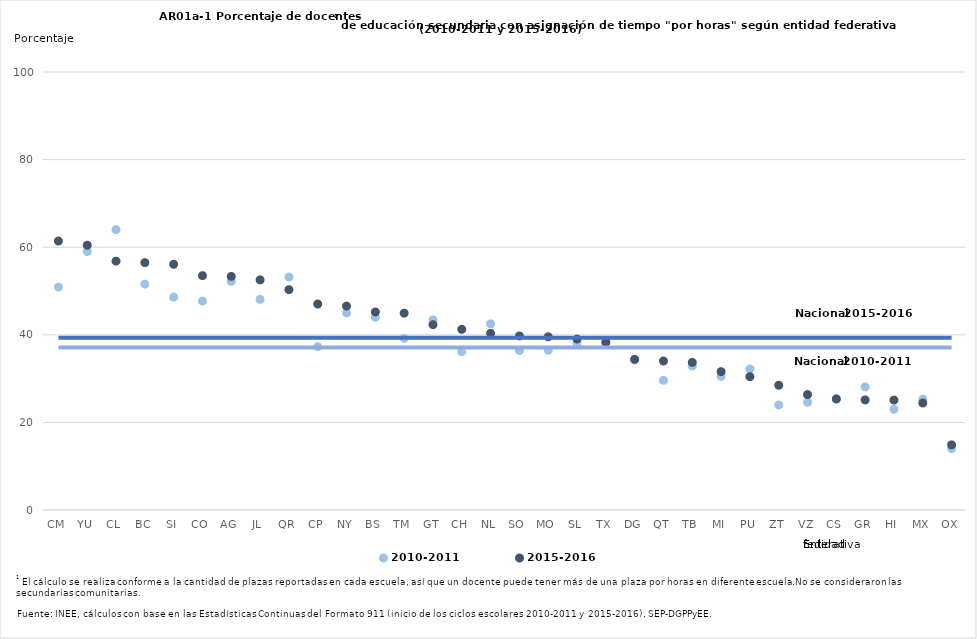
| Category | 2010-2011 | 2015-2016 | N 10-11 | N 15-16 |
|---|---|---|---|---|
| CM | 50.902 | 61.41 | 37.1 | 39.3 |
| YU | 59 | 60.449 | 37.1 | 39.3 |
| CL | 64 | 56.818 | 37.1 | 39.3 |
| BC | 51.576 | 56.48 | 37.1 | 39.3 |
| SI | 48.6 | 56.097 | 37.1 | 39.3 |
| CO | 47.7 | 53.508 | 37.1 | 39.3 |
| AG | 52.2 | 53.327 | 37.1 | 39.3 |
| JL | 48.1 | 52.542 | 37.1 | 39.3 |
| QR | 53.2 | 50.308 | 37.1 | 39.3 |
| CP | 37.3 | 47.025 | 37.1 | 39.3 |
| NY | 45 | 46.554 | 37.1 | 39.3 |
| BS | 43.998 | 45.213 | 37.1 | 39.3 |
| TM | 39.2 | 44.934 | 37.1 | 39.3 |
| GT | 43.4 | 42.321 | 37.1 | 39.3 |
| CH | 36.141 | 41.246 | 37.1 | 39.3 |
| NL | 42.5 | 40.335 | 37.1 | 39.3 |
| SO | 36.4 | 39.734 | 37.1 | 39.3 |
| MO | 36.5 | 39.553 | 37.1 | 39.3 |
| SL | 38 | 39.034 | 37.1 | 39.3 |
| TX | 38.5 | 38.231 | 37.1 | 39.3 |
| DG | 34.3 | 34.392 | 37.1 | 39.3 |
| QT | 29.6 | 34.012 | 37.1 | 39.3 |
| TB | 32.9 | 33.701 | 37.1 | 39.3 |
| MI | 30.5 | 31.589 | 37.1 | 39.3 |
| PU | 32.191 | 30.446 | 37.1 | 39.3 |
| ZT | 23.97 | 28.475 | 37.1 | 39.3 |
| VZ | 24.6 | 26.354 | 37.1 | 39.3 |
| CS | 25.3 | 25.372 | 37.1 | 39.3 |
| GR | 28.1 | 25.14 | 37.1 | 39.3 |
| HI | 23 | 25.095 | 37.1 | 39.3 |
| MX | 25.3 | 24.426 | 37.1 | 39.3 |
| OX | 14.019 | 14.876 | 37.1 | 39.3 |